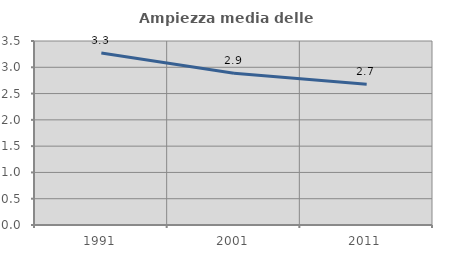
| Category | Ampiezza media delle famiglie |
|---|---|
| 1991.0 | 3.273 |
| 2001.0 | 2.886 |
| 2011.0 | 2.676 |